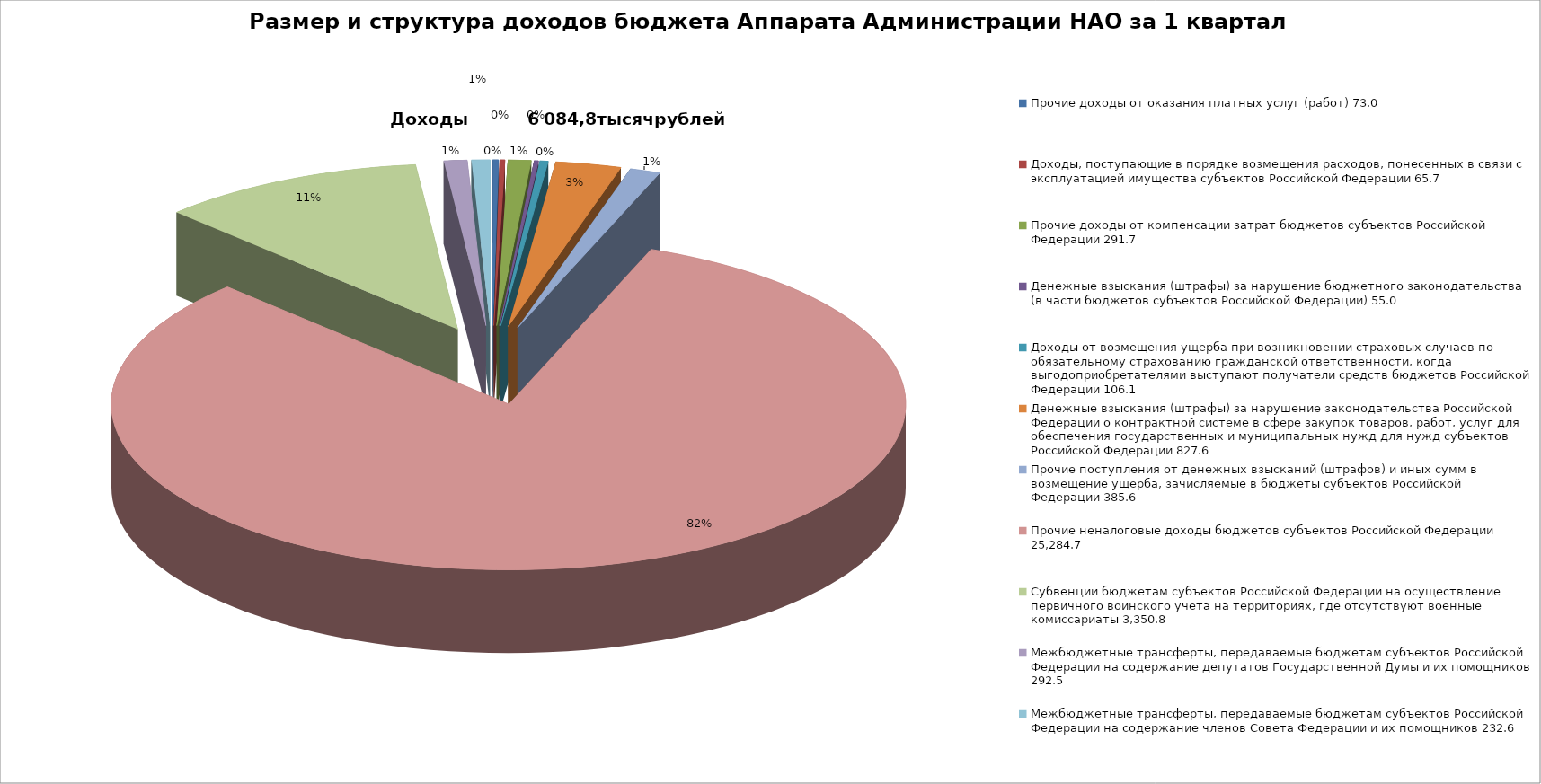
| Category | Размер и структура доходов бюджета Аппарата Администрации НАО за 1 полугодие 2016 года |
|---|---|
| 0 | 73 |
| 1 | 65.7 |
| 2 | 291.7 |
| 3 | 55 |
| 4 | 106.1 |
| 5 | 827.6 |
| 6 | 385.6 |
| 7 | 25284.7 |
| 8 | 3350.8 |
| 9 | 292.5 |
| 10 | 232.6 |